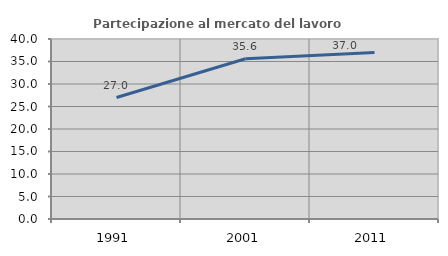
| Category | Partecipazione al mercato del lavoro  femminile |
|---|---|
| 1991.0 | 26.996 |
| 2001.0 | 35.603 |
| 2011.0 | 37.021 |